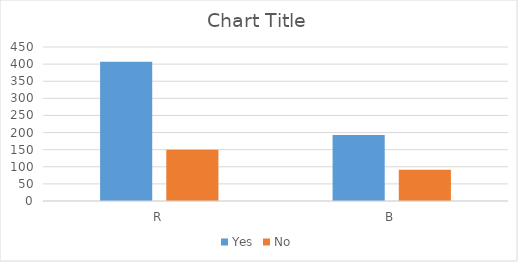
| Category | Yes | No |
|---|---|---|
| R | 407 | 150 |
| B | 193 | 91 |